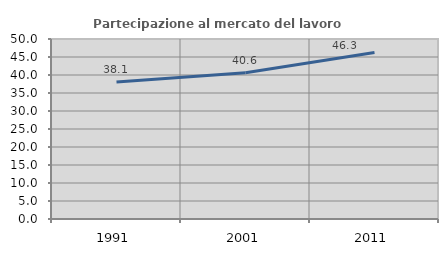
| Category | Partecipazione al mercato del lavoro  femminile |
|---|---|
| 1991.0 | 38.055 |
| 2001.0 | 40.634 |
| 2011.0 | 46.257 |